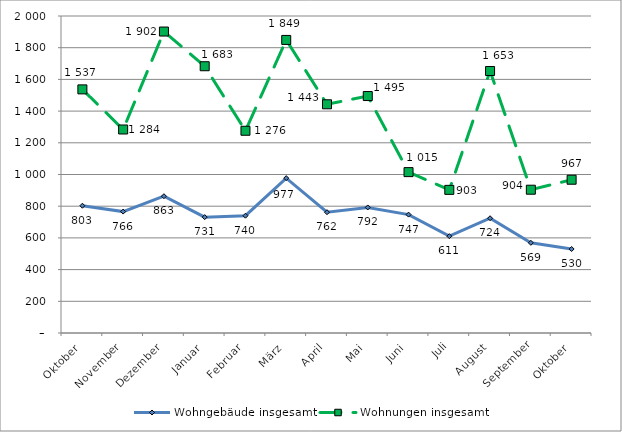
| Category | Wohngebäude insgesamt | Wohnungen insgesamt |
|---|---|---|
| Oktober | 803 | 1537 |
| November | 766 | 1284 |
| Dezember | 863 | 1902 |
| Januar | 731 | 1683 |
| Februar | 740 | 1276 |
| März | 977 | 1849 |
| April | 762 | 1443 |
| Mai | 792 | 1495 |
| Juni | 747 | 1015 |
| Juli | 611 | 903 |
| August | 724 | 1653 |
| September | 569 | 904 |
| Oktober | 530 | 967 |